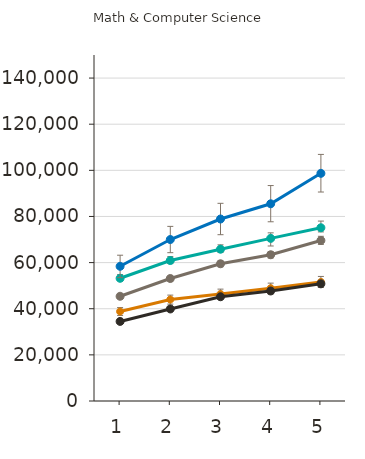
| Category | College-level Certificate | College-level Diploma | Bachelor's Degree | Master's Degree | Doctoral Degree | Professional Degree |
|---|---|---|---|---|---|---|
| 1.0 | 38800 | 34500 | 45400 | 53200 | 58400 |  |
| 2.0 | 44000 | 39900 | 53100 | 60900 | 70000 |  |
| 3.0 | 46400 | 45200 | 59500 | 65800 | 78900 |  |
| 4.0 | 48900 | 47700 | 63400 | 70500 | 85500 |  |
| 5.0 | 51600 | 50800 | 69600 | 75100 | 98700 |  |